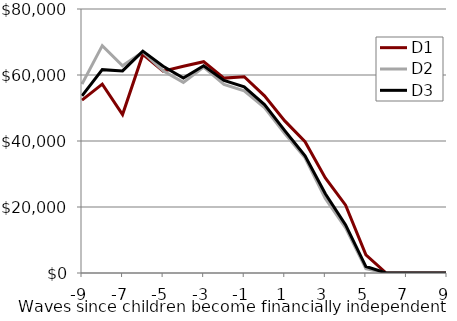
| Category | D1 | D2 | D3 |
|---|---|---|---|
| -9.0 | 52375.58 | 57266.22 | 53687.08 |
| -8.0 | 57236.34 | 68898.42 | 61618.32 |
| -7.0 | 48028.12 | 62813.88 | 61245.61 |
| -6.0 | 66239.7 | 67008.4 | 67239.36 |
| -5.0 | 61153.85 | 61245.61 | 62634.93 |
| -4.0 | 62634.93 | 57767.18 | 59055.79 |
| -3.0 | 64037.49 | 62388.55 | 62820.38 |
| -2.0 | 59055.79 | 57165.55 | 58329.15 |
| -1.0 | 59481.09 | 55171 | 56426.99 |
| 0.0 | 53687.08 | 50107.94 | 51038.01 |
| 1.0 | 46087.93 | 42288.64 | 43152.95 |
| 2.0 | 39786.24 | 34900.21 | 35533.61 |
| 3.0 | 28789.28 | 22600.33 | 24031.15 |
| 4.0 | 20561.03 | 13701.82 | 14582.29 |
| 5.0 | 5504.51 | 1312.44 | 1954.412 |
| 6.0 | 0 | 0 | 0 |
| 7.0 | 0 | 0 | 0 |
| 8.0 | 0 | 0 | 0 |
| 9.0 | 0 | 0 | 0 |